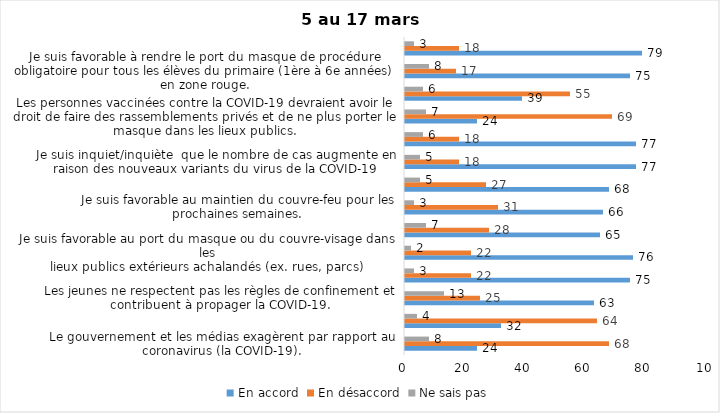
| Category | En accord | En désaccord | Ne sais pas |
|---|---|---|---|
| Le gouvernement et les médias exagèrent par rapport au coronavirus (la COVID-19). | 24 | 68 | 8 |
| Il est exagéré de rester chez soi pour se protéger contre le coronavirus (la COVID-19). | 32 | 64 | 4 |
| Les jeunes ne respectent pas les règles de confinement et contribuent à propager la COVID-19. | 63 | 25 | 13 |
| C’est une bonne chose que les policiers puissent donner facilement des contraventions aux gens qui ne respectent pas les mesures pour prévenir le coronavirus (la COVID-19). | 75 | 22 | 3 |
| Je suis favorable au port du masque ou du couvre-visage dans les
lieux publics extérieurs achalandés (ex. rues, parcs) | 76 | 22 | 2 |
| Les activités extérieures en petits groupes sont sécuritaires pour éviter la propagation de la COVID-19. | 65 | 28 | 7 |
| Je suis favorable au maintien du couvre-feu pour les prochaines semaines. | 66 | 31 | 3 |
| J’ai peur que le système de santé soit débordé par les cas de COVID-19 suite à l’assouplissement des mesures | 68 | 27 | 5 |
| Je suis inquiet/inquiète  que le nombre de cas augmente en raison des nouveaux variants du virus de la COVID-19 | 77 | 18 | 5 |
| La frontière entre le Canada et les États-Unis devrait être fermée au moins jusqu’en septembre 2021 | 77 | 18 | 6 |
| Les personnes vaccinées contre la COVID-19 devraient avoir le droit de faire des rassemblements privés et de ne plus porter le masque dans les lieux publics. | 24 | 69 | 7 |
| Je crois que le gouvernement a implanté trop de mesures par rapport à ce que la santé publique recommandait (ex. : fermeture des restaurants). | 39 | 55 | 6 |
| Je suis favorable à rendre le port du masque de procédure obligatoire pour tous les élèves du primaire (1ère à 6e années) en zone rouge. | 75 | 17 | 8 |
| Pour éviter la propagation de la COVID-19, c’est une bonne chose que le gouvernement maintiennent des mesures préventives plus strictes pour les régions entourant Montréal. | 79 | 18 | 3 |